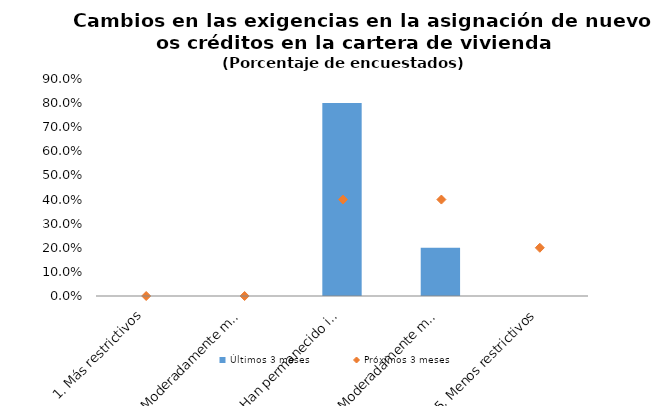
| Category | Últimos 3 meses |
|---|---|
| 1. Más restrictivos | 0 |
| 2. Moderadamente más restrictivos | 0 |
| 3. Han permanecido igual | 0.8 |
| 4. Moderadamente menos restrictivos | 0.2 |
| 5. Menos restrictivos | 0 |